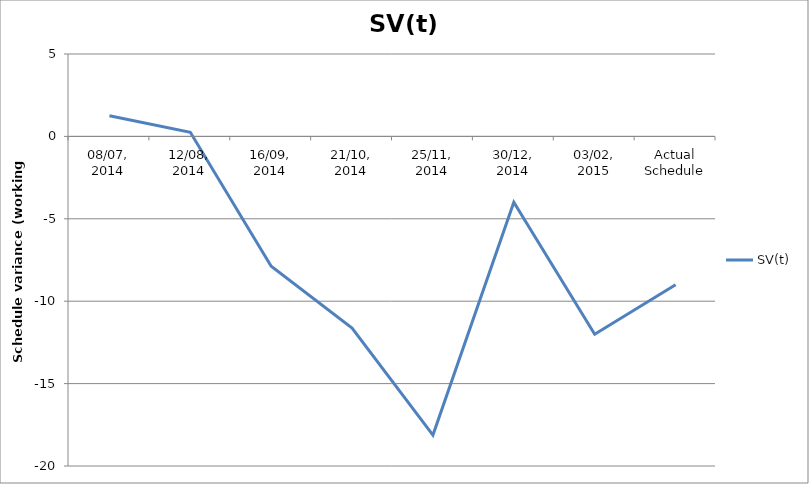
| Category | SV(t) |
|---|---|
| 08/07, 2014 | 1.25 |
| 12/08, 2014 | 0.25 |
| 16/09, 2014 | -7.875 |
| 21/10, 2014 | -11.625 |
| 25/11, 2014 | -18.125 |
| 30/12, 2014 | -4 |
| 03/02, 2015 | -12 |
| Actual Schedule | -9 |